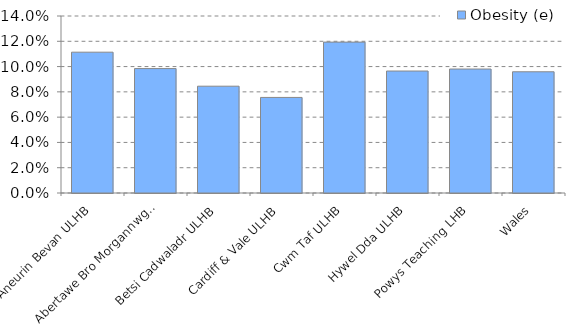
| Category | Obesity (e) |
|---|---|
| Aneurin Bevan ULHB | 0.111 |
| Abertawe Bro Morgannwg ULHB | 0.098 |
| Betsi Cadwaladr ULHB | 0.084 |
| Cardiff & Vale ULHB | 0.076 |
| Cwm Taf ULHB | 0.119 |
| Hywel Dda ULHB | 0.096 |
| Powys Teaching LHB | 0.098 |
| Wales | 0.096 |